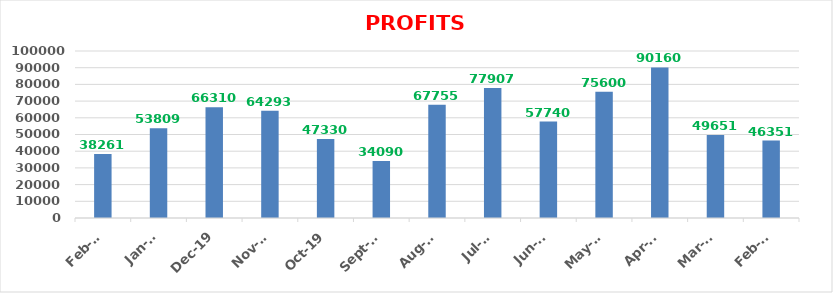
| Category | PROFITS (Rs.) |
|---|---|
| 2020-02-01 | 38261 |
| 2020-01-01 | 53809 |
| 2019-12-01 | 66310 |
| 2019-11-01 | 64293 |
| 2019-10-01 | 47330 |
| 2019-09-01 | 34090 |
| 2019-08-01 | 67755 |
| 2019-07-01 | 77907 |
| 2019-06-01 | 57740 |
| 2019-05-01 | 75600 |
| 2019-04-01 | 90160 |
| 2019-03-01 | 49651 |
| 2019-02-01 | 46351 |